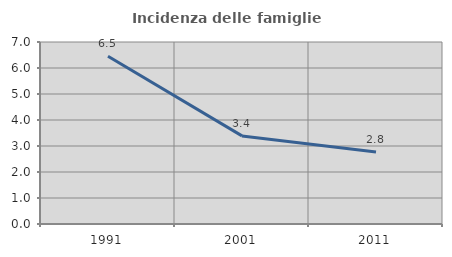
| Category | Incidenza delle famiglie numerose |
|---|---|
| 1991.0 | 6.451 |
| 2001.0 | 3.389 |
| 2011.0 | 2.767 |